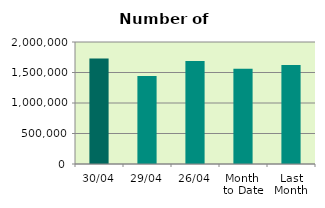
| Category | Series 0 |
|---|---|
| 30/04 | 1730970 |
| 29/04 | 1440748 |
| 26/04 | 1686930 |
| Month 
to Date | 1561575.6 |
| Last
Month | 1624932.286 |